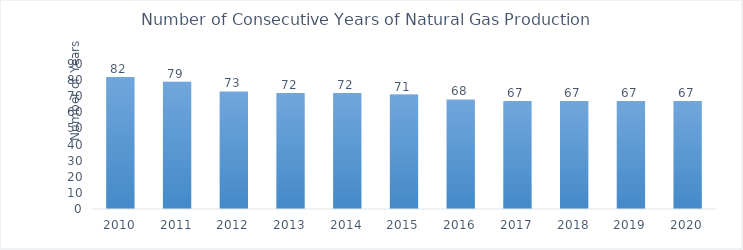
| Category | Number of Consecutive Years of Natural Gas Production* |
|---|---|
| 2010.0 | 82 |
| 2011.0 | 79 |
| 2012.0 | 73 |
| 2013.0 | 72 |
| 2014.0 | 72 |
| 2015.0 | 71 |
| 2016.0 | 68 |
| 2017.0 | 67 |
| 2018.0 | 67 |
| 2019.0 | 67 |
| 2020.0 | 67 |